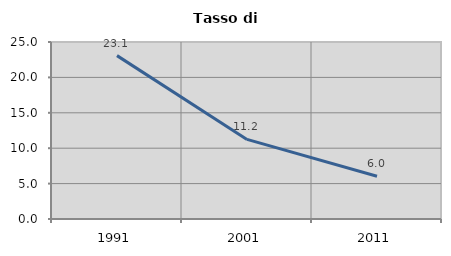
| Category | Tasso di disoccupazione   |
|---|---|
| 1991.0 | 23.077 |
| 2001.0 | 11.243 |
| 2011.0 | 6.03 |